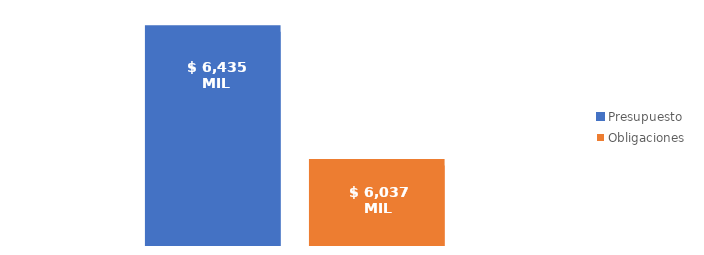
| Category | Presupuesto | Obligaciones |
|---|---|---|
| Total | 6435377824384.306 | 6037123789104.457 |